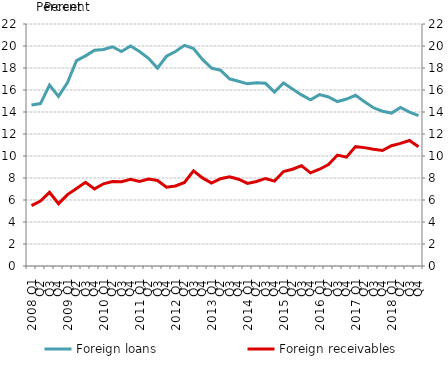
| Category | Foreign loans |
|---|---|
| 2008 Q1 | 14.631 |
| Q2 | 14.765 |
| Q3 | 16.451 |
| Q4 | 15.419 |
| 2009 Q1 | 16.679 |
| Q2 | 18.674 |
| Q3 | 19.102 |
| Q4 | 19.621 |
| 2010 Q1 | 19.678 |
| Q2 | 19.929 |
| Q3 | 19.504 |
| Q4 | 20.005 |
| 2011 Q1 | 19.504 |
| Q2 | 18.884 |
| Q3 | 17.991 |
| Q4 | 19.071 |
| 2012 Q1 | 19.498 |
| Q2 | 20.056 |
| Q3 | 19.776 |
| Q4 | 18.782 |
| 2013 Q1 | 17.989 |
| Q2 | 17.803 |
| Q3 | 17.019 |
| Q4 | 16.797 |
| 2014 Q1 | 16.56 |
| Q2 | 16.661 |
| Q3 | 16.606 |
| Q4 | 15.812 |
| 2015 Q1 | 16.632 |
| Q2 | 16.096 |
| Q3 | 15.552 |
| Q4 | 15.116 |
| 2016 Q1 | 15.579 |
| Q2 | 15.366 |
| Q3 | 14.951 |
| Q4 | 15.178 |
| 2017 Q1 | 15.52 |
| Q2 | 14.924 |
| Q3 | 14.384 |
| Q4 | 14.069 |
| 2018 Q1 | 13.905 |
| Q2 | 14.406 |
| Q3 | 13.989 |
| Q4 | 13.669 |